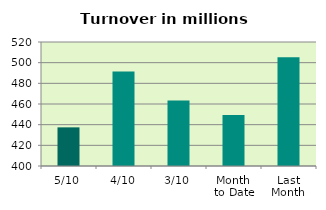
| Category | Series 0 |
|---|---|
| 5/10 | 437.398 |
| 4/10 | 491.418 |
| 3/10 | 463.404 |
| Month 
to Date | 449.25 |
| Last
Month | 505.274 |